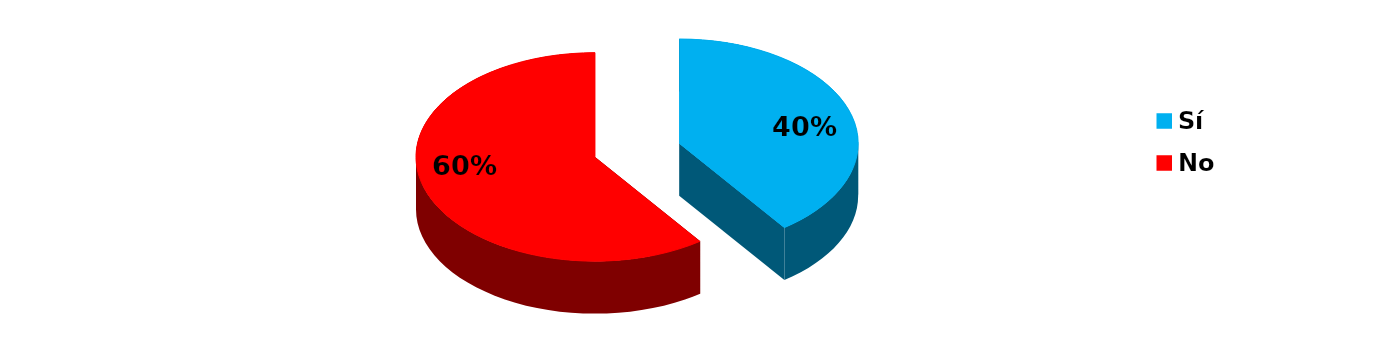
| Category | Series 0 |
|---|---|
| Sí | 2 |
| No | 3 |